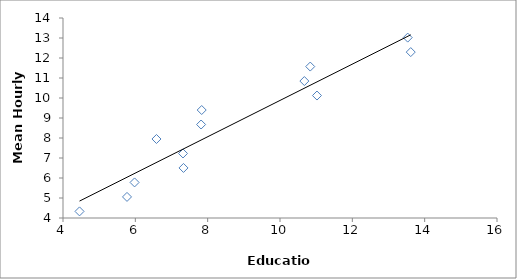
| Category | Series 0 |
|---|---|
| 4.4567 | 4.33 |
| 5.77 | 5.054 |
| 5.9787 | 5.778 |
| 7.3317 | 6.502 |
| 7.3182 | 7.227 |
| 6.5844 | 7.951 |
| 7.8182 | 8.675 |
| 7.8351 | 9.399 |
| 11.0223 | 10.123 |
| 10.6738 | 10.847 |
| 10.8361 | 11.571 |
| 13.615 | 12.295 |
| 13.531 | 13.019 |